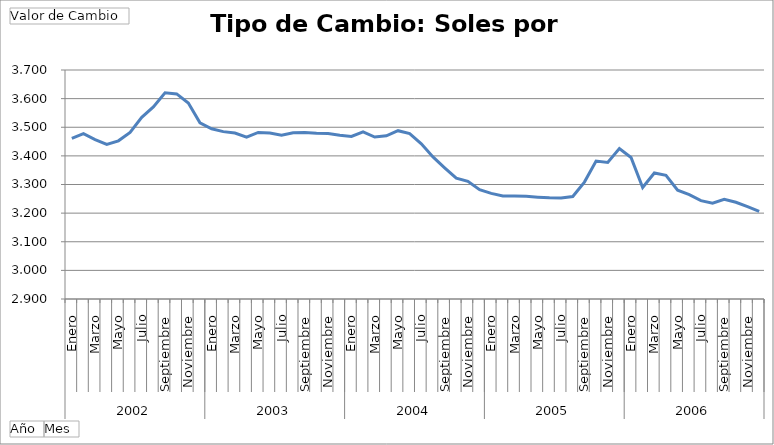
| Category | Total |
|---|---|
| 0 | 3.461 |
| 1 | 3.478 |
| 2 | 3.457 |
| 3 | 3.44 |
| 4 | 3.453 |
| 5 | 3.482 |
| 6 | 3.535 |
| 7 | 3.571 |
| 8 | 3.62 |
| 9 | 3.616 |
| 10 | 3.584 |
| 11 | 3.515 |
| 12 | 3.495 |
| 13 | 3.485 |
| 14 | 3.48 |
| 15 | 3.465 |
| 16 | 3.482 |
| 17 | 3.48 |
| 18 | 3.472 |
| 19 | 3.481 |
| 20 | 3.482 |
| 21 | 3.479 |
| 22 | 3.478 |
| 23 | 3.472 |
| 24 | 3.468 |
| 25 | 3.484 |
| 26 | 3.466 |
| 27 | 3.47 |
| 28 | 3.488 |
| 29 | 3.478 |
| 30 | 3.442 |
| 31 | 3.396 |
| 32 | 3.358 |
| 33 | 3.322 |
| 34 | 3.311 |
| 35 | 3.282 |
| 36 | 3.269 |
| 37 | 3.26 |
| 38 | 3.26 |
| 39 | 3.259 |
| 40 | 3.256 |
| 41 | 3.253 |
| 42 | 3.253 |
| 43 | 3.258 |
| 44 | 3.308 |
| 45 | 3.382 |
| 46 | 3.377 |
| 47 | 3.425 |
| 48 | 3.394 |
| 49 | 3.29 |
| 50 | 3.34 |
| 51 | 3.332 |
| 52 | 3.28 |
| 53 | 3.265 |
| 54 | 3.244 |
| 55 | 3.235 |
| 56 | 3.248 |
| 57 | 3.238 |
| 58 | 3.223 |
| 59 | 3.206 |